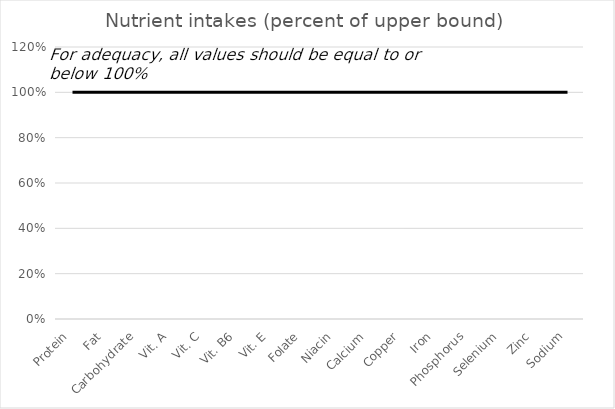
| Category | Series 0 |
|---|---|
| 0 | 0 |
| 1 | 0 |
| 2 | 0 |
| 3 | 0 |
| 4 | 0 |
| 5 | 0 |
| 6 | 0 |
| 7 | 0 |
| 8 | 0 |
| 9 | 0 |
| 10 | 0 |
| 11 | 0 |
| 12 | 0 |
| 13 | 0 |
| 14 | 0 |
| 15 | 0 |